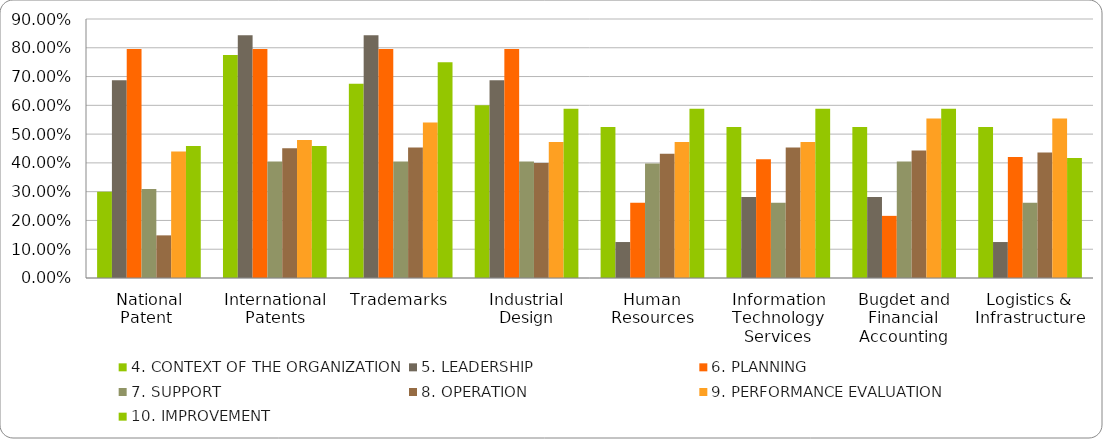
| Category | 4. CONTEXT OF THE ORGANIZATION | 5. LEADERSHIP | 6. PLANNING | 7. SUPPORT | 8. OPERATION | 9. PERFORMANCE EVALUATION | 10. IMPROVEMENT |
|---|---|---|---|---|---|---|---|
| National Patent  | 0.3 | 0.688 | 0.795 | 0.31 | 0.148 | 0.439 | 0.458 |
| International Patents | 0.775 | 0.844 | 0.795 | 0.405 | 0.451 | 0.48 | 0.458 |
| Trademarks | 0.675 | 0.844 | 0.795 | 0.405 | 0.454 | 0.541 | 0.75 |
| Industrial Design | 0.6 | 0.688 | 0.795 | 0.405 | 0.4 | 0.473 | 0.588 |
| Human Resources | 0.525 | 0.125 | 0.261 | 0.398 | 0.432 | 0.473 | 0.588 |
| Information Technology Services | 0.525 | 0.281 | 0.413 | 0.262 | 0.453 | 0.473 | 0.588 |
| Bugdet and Financial Accounting | 0.525 | 0.281 | 0.216 | 0.405 | 0.443 | 0.554 | 0.588 |
| Logistics & Infrastructure | 0.525 | 0.125 | 0.42 | 0.262 | 0.436 | 0.554 | 0.417 |